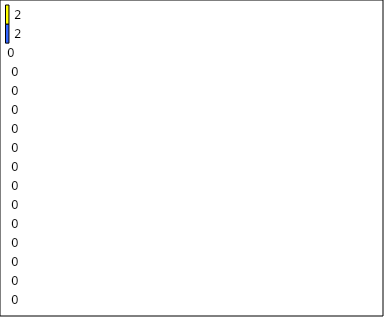
| Category | -2 | -1 | 0 | 1 | 2 | 3 | 4 | 5 | 6 | 7 | 8 | 9 | 10 | 11 | 12 | Perfect Round |
|---|---|---|---|---|---|---|---|---|---|---|---|---|---|---|---|---|
| 0 | 0 | 0 | 0 | 0 | 0 | 0 | 0 | 0 | 0 | 0 | 0 | 0 | 0 | 0 | 2 | 2 |